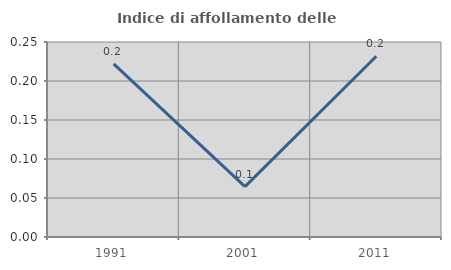
| Category | Indice di affollamento delle abitazioni  |
|---|---|
| 1991.0 | 0.222 |
| 2001.0 | 0.065 |
| 2011.0 | 0.232 |